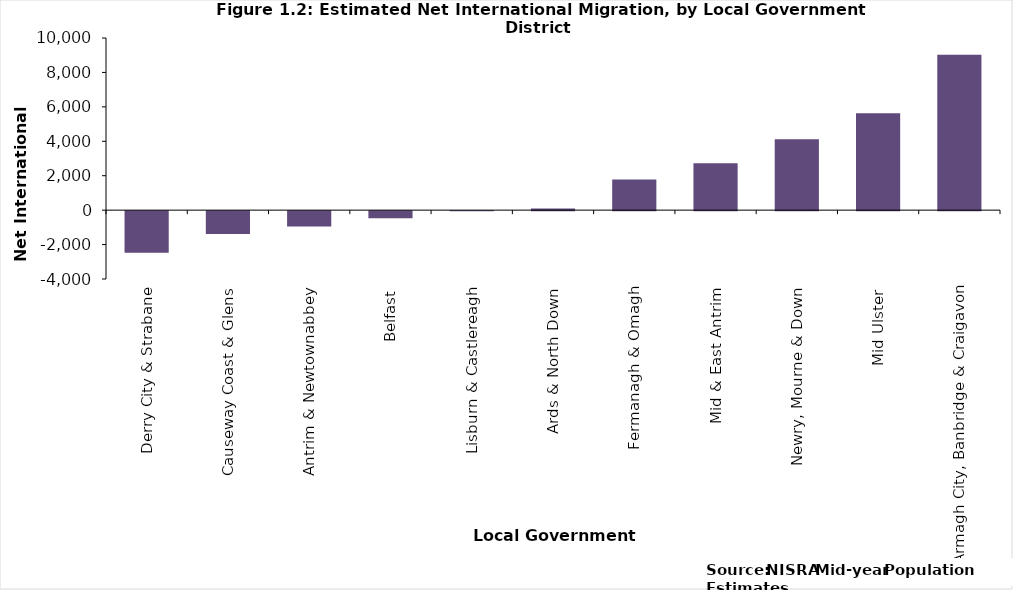
| Category | Total |
|---|---|
| Derry City & Strabane | -2419 |
| Causeway Coast & Glens | -1334 |
| Antrim & Newtownabbey | -886 |
| Belfast | -408 |
| Lisburn & Castlereagh | -4 |
| Ards & North Down | 98 |
| Fermanagh & Omagh | 1782 |
| Mid & East Antrim | 2727 |
| Newry, Mourne & Down | 4111 |
| Mid Ulster | 5634 |
| Armagh City, Banbridge & Craigavon | 9022 |